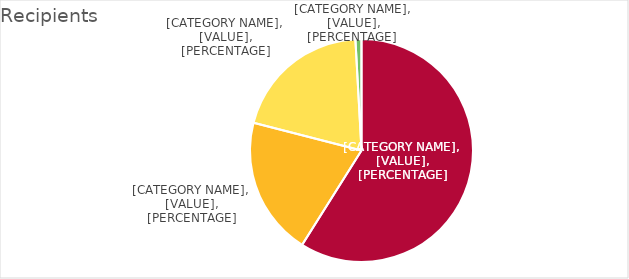
| Category | Series 0 |
|---|---|
| 4 Year Public | 41697 |
| 2 Year Public | 14198 |
| Private | 14229 |
| Proprietary | 618 |